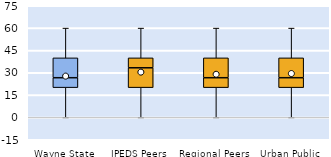
| Category | 25th | 50th | 75th |
|---|---|---|---|
| Wayne State | 20 | 6.667 | 13.333 |
| IPEDS Peers | 20 | 13.333 | 6.667 |
| Regional Peers | 20 | 6.667 | 13.333 |
| Urban Public | 20 | 6.667 | 13.333 |